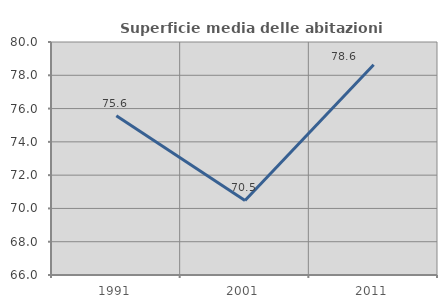
| Category | Superficie media delle abitazioni occupate |
|---|---|
| 1991.0 | 75.566 |
| 2001.0 | 70.479 |
| 2011.0 | 78.634 |